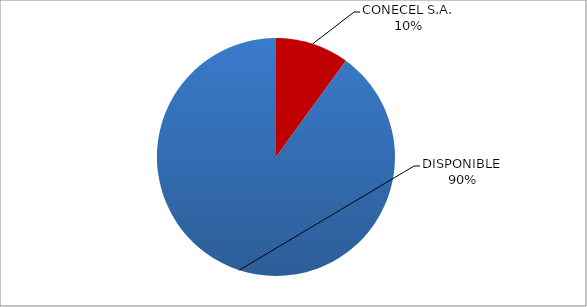
| Category | CÓDIGO DE RED 92 |
|---|---|
| CONECEL S.A. | 0.1 |
| DISPONIBLE | 0.9 |